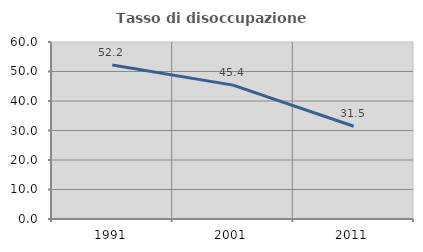
| Category | Tasso di disoccupazione giovanile  |
|---|---|
| 1991.0 | 52.195 |
| 2001.0 | 45.385 |
| 2011.0 | 31.452 |